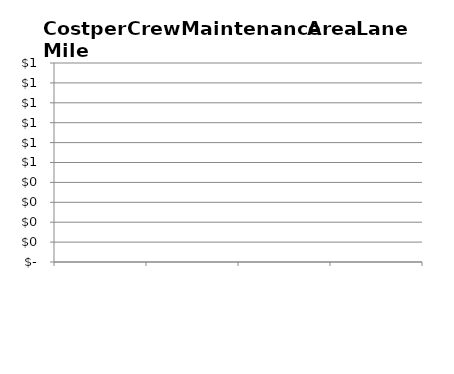
| Category |    Cost per Maintenance Area Lane Mile |
|---|---|
|   | 0 |
|   | 0 |
|   | 0 |
|   | 0 |